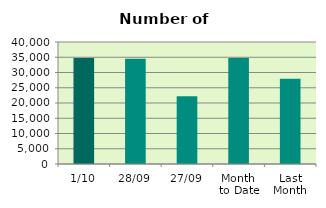
| Category | Series 0 |
|---|---|
| 1/10 | 34728 |
| 28/09 | 34536 |
| 27/09 | 22188 |
| Month 
to Date | 34728 |
| Last
Month | 27963.2 |